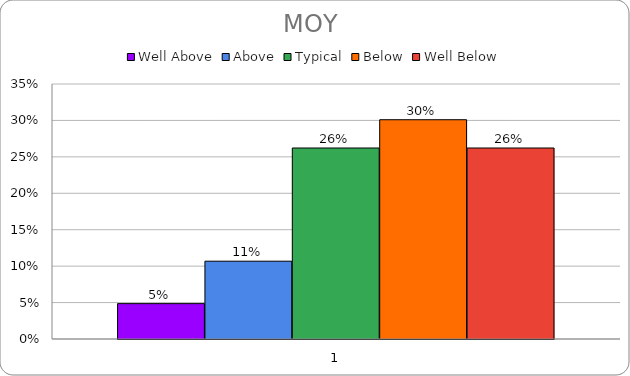
| Category | Well Above | Above  | Typical | Below | Well Below |
|---|---|---|---|---|---|
| 0 | 0.049 | 0.107 | 0.262 | 0.301 | 0.262 |